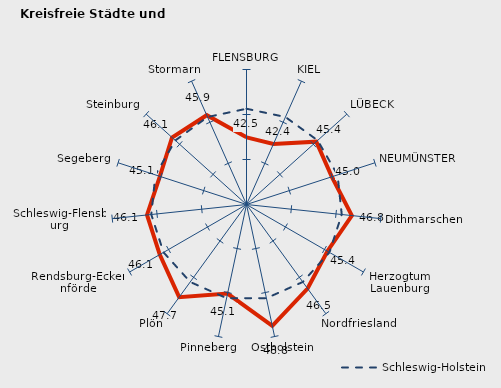
| Category | Kreise | Schleswig-Holstein |
|---|---|---|
| FLENSBURG | 42.463 | 45.64 |
| KIEL | 42.358 | 45.64 |
| LÜBECK | 45.43 | 45.64 |
| NEUMÜNSTER | 44.969 | 45.64 |
| Dithmarschen | 46.771 | 45.64 |
| Herzogtum Lauenburg | 45.38 | 45.64 |
| Nordfriesland | 46.541 | 45.64 |
| Ostholstein | 48.787 | 45.64 |
| Pinneberg | 45.119 | 45.64 |
| Plön | 47.727 | 45.64 |
| Rendsburg-Eckernförde | 46.13 | 45.64 |
| Schleswig-Flensburg | 46.115 | 45.64 |
| Segeberg | 45.12 | 45.64 |
| Steinburg | 46.134 | 45.64 |
| Stormarn | 45.861 | 45.64 |